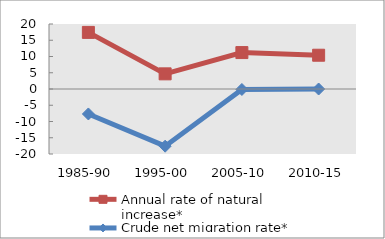
| Category | Annual rate of natural increase* | Crude net migration rate* |
|---|---|---|
| 1985-90 | 17.418 | -7.678 |
| 1995-00 | 4.661 | -17.593 |
| 2005-10 | 11.21 | -0.146 |
| 2010-15 | 10.391 | 0 |